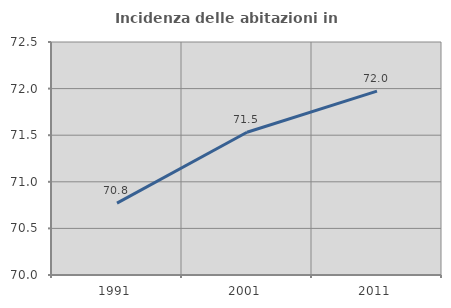
| Category | Incidenza delle abitazioni in proprietà  |
|---|---|
| 1991.0 | 70.771 |
| 2001.0 | 71.532 |
| 2011.0 | 71.973 |